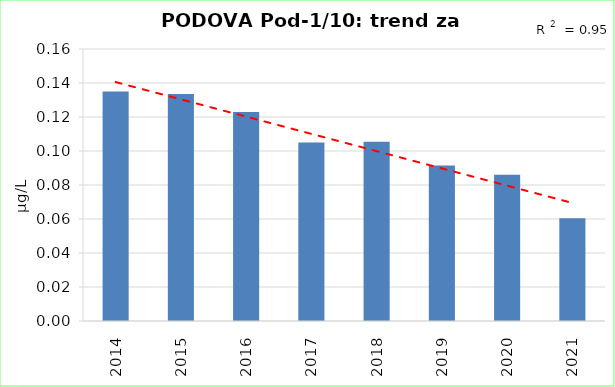
| Category | Vsota |
|---|---|
| 2014 | 0.135 |
| 2015 | 0.134 |
| 2016 | 0.123 |
| 2017 | 0.105 |
| 2018 | 0.106 |
| 2019 | 0.092 |
| 2020 | 0.086 |
| 2021 | 0.06 |